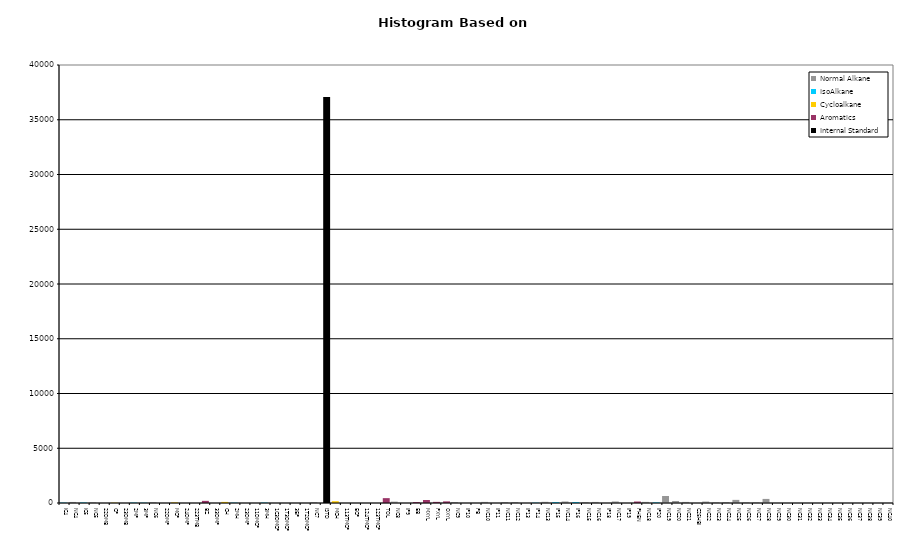
| Category | Normal Alkane | IsoAlkane | Cycloalkane | Aromatics | Internal Standard |
|---|---|---|---|---|---|
| IC4 | 0 | 32 | 0 | 0 | 0 |
| NC4 | 95 | 0 | 0 | 0 | 0 |
| IC5 | 0 | 44 | 0 | 0 | 0 |
| NC5 | 59 | 0 | 0 | 0 | 0 |
| 22DMB | 0 | 0 | 0 | 0 | 0 |
| CP | 0 | 0 | 27 | 0 | 0 |
| 23DMB | 0 | 0 | 0 | 0 | 0 |
| 2MP | 0 | 36 | 0 | 0 | 0 |
| 3MP | 0 | 28 | 0 | 0 | 0 |
| NC6 | 74 | 0 | 0 | 0 | 0 |
| 22DMP | 0 | 0 | 0 | 0 | 0 |
| MCP | 0 | 0 | 54 | 0 | 0 |
| 24DMP | 0 | 0 | 0 | 0 | 0 |
| 223TMB | 0 | 0 | 0 | 0 | 0 |
| BZ | 0 | 0 | 0 | 195 | 0 |
| 33DMP | 0 | 0 | 0 | 0 | 0 |
| CH | 0 | 0 | 100 | 0 | 0 |
| 2MH | 0 | 30 | 0 | 0 | 0 |
| 23DMP | 0 | 0 | 0 | 0 | 0 |
| 11DMCP | 0 | 0 | 0 | 0 | 0 |
| 3MH | 0 | 36 | 0 | 0 | 0 |
| 1C3DMCP | 0 | 0 | 0 | 0 | 0 |
| 1T3DMCP | 0 | 0 | 0 | 0 | 0 |
| 3EP | 0 | 0 | 0 | 0 | 0 |
| 1T2DMCP | 0 | 0 | 0 | 0 | 0 |
| NC7 | 84 | 0 | 0 | 0 | 0 |
| ISTD | 0 | 0 | 0 | 0 | 37088 |
| MCH | 0 | 0 | 164 | 0 | 0 |
| 113TMCP | 0 | 0 | 0 | 0 | 0 |
| ECP | 0 | 0 | 0 | 0 | 0 |
| 124TMCP | 0 | 0 | 0 | 0 | 0 |
| 123TMCP | 0 | 0 | 0 | 0 | 0 |
| TOL | 0 | 0 | 0 | 444 | 0 |
| NC8 | 123 | 0 | 0 | 0 | 0 |
| IP9 | 0 | 0 | 0 | 0 | 0 |
| EB | 0 | 0 | 0 | 86 | 0 |
| MXYL | 0 | 0 | 0 | 275 | 0 |
| PXYL | 0 | 0 | 0 | 103 | 0 |
| OXYL | 0 | 0 | 0 | 148 | 0 |
| NC9 | 89 | 0 | 0 | 0 | 0 |
| IP10 | 0 | 0 | 0 | 0 | 0 |
| PB | 0 | 0 | 0 | 0 | 0 |
| NC10 | 100 | 0 | 0 | 0 | 0 |
| IP11 | 0 | 0 | 0 | 0 | 0 |
| NC11 | 86 | 0 | 0 | 0 | 0 |
| NC12 | 94 | 0 | 0 | 0 | 0 |
| IP13 | 0 | 0 | 0 | 0 | 0 |
| IP14 | 0 | 27 | 0 | 0 | 0 |
| NC13 | 107 | 0 | 0 | 0 | 0 |
| IP15 | 0 | 75 | 0 | 0 | 0 |
| NC14 | 137 | 0 | 0 | 0 | 0 |
| IP16 | 0 | 81 | 0 | 0 | 0 |
| NC15 | 79 | 0 | 0 | 0 | 0 |
| NC16 | 97 | 0 | 0 | 0 | 0 |
| IP18 | 0 | 0 | 0 | 0 | 0 |
| NC17 | 139 | 0 | 0 | 0 | 0 |
| IP19 | 0 | 0 | 0 | 0 | 0 |
| PHEN | 0 | 0 | 0 | 135 | 0 |
| NC18 | 101 | 0 | 0 | 0 | 0 |
| IP20 | 0 | 51 | 0 | 0 | 0 |
| NC19 | 638 | 0 | 0 | 0 | 0 |
| NC20 | 181 | 0 | 0 | 0 | 0 |
| NC21 | 99 | 0 | 0 | 0 | 0 |
| C25HBI | 0 | 0 | 0 | 0 | 0 |
| NC22 | 131 | 0 | 0 | 0 | 0 |
| NC23 | 57 | 0 | 0 | 0 | 0 |
| NC24 | 84 | 0 | 0 | 0 | 0 |
| NC25 | 285 | 0 | 0 | 0 | 0 |
| NC26 | 58 | 0 | 0 | 0 | 0 |
| NC27 | 57 | 0 | 0 | 0 | 0 |
| NC28 | 373 | 0 | 0 | 0 | 0 |
| NC29 | 0 | 0 | 0 | 0 | 0 |
| NC30 | 0 | 0 | 0 | 0 | 0 |
| NC31 | 0 | 0 | 0 | 0 | 0 |
| NC32 | 0 | 0 | 0 | 0 | 0 |
| NC33 | 0 | 0 | 0 | 0 | 0 |
| NC34 | 0 | 0 | 0 | 0 | 0 |
| NC35 | 0 | 0 | 0 | 0 | 0 |
| NC36 | 0 | 0 | 0 | 0 | 0 |
| NC37 | 0 | 0 | 0 | 0 | 0 |
| NC38 | 0 | 0 | 0 | 0 | 0 |
| NC39 | 0 | 0 | 0 | 0 | 0 |
| NC40 | 0 | 0 | 0 | 0 | 0 |